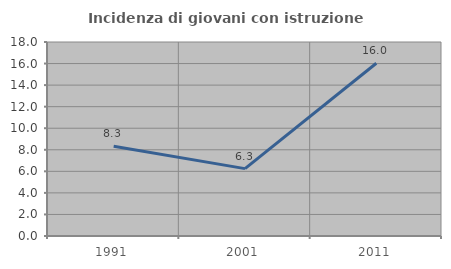
| Category | Incidenza di giovani con istruzione universitaria |
|---|---|
| 1991.0 | 8.333 |
| 2001.0 | 6.25 |
| 2011.0 | 16.026 |